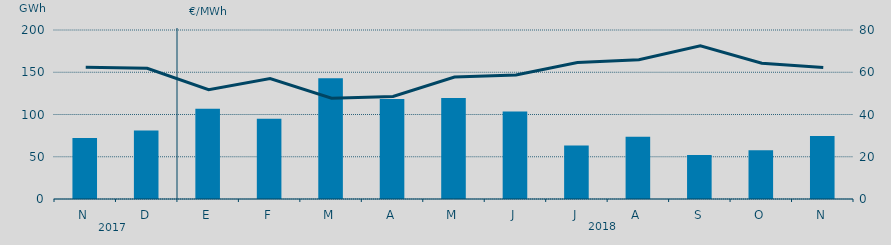
| Category | Energía a subir |
|---|---|
| N | 72.29 |
| D | 81.05 |
| E | 106.847 |
| F | 95.118 |
| M | 142.766 |
| A | 118.38 |
| M | 119.519 |
| J | 103.599 |
| J | 63.222 |
| A | 73.63 |
| S | 52.192 |
| O | 57.766 |
| N | 74.612 |